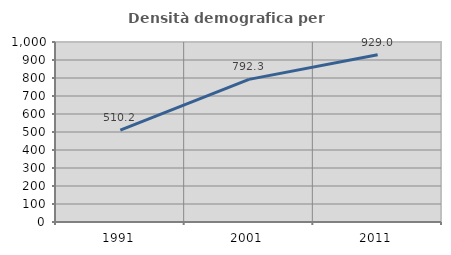
| Category | Densità demografica |
|---|---|
| 1991.0 | 510.244 |
| 2001.0 | 792.265 |
| 2011.0 | 928.962 |